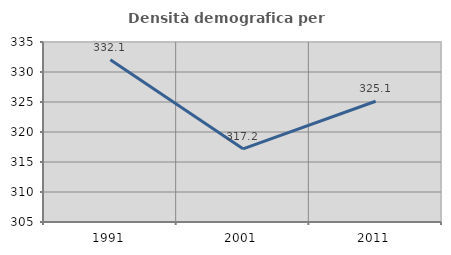
| Category | Densità demografica |
|---|---|
| 1991.0 | 332.055 |
| 2001.0 | 317.194 |
| 2011.0 | 325.127 |